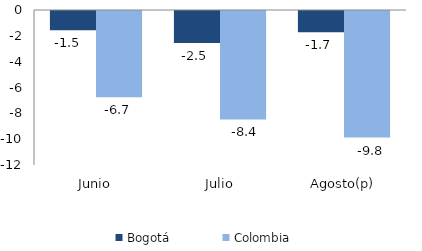
| Category | Bogotá | Colombia |
|---|---|---|
| Junio | -1.485 | -6.684 |
| Julio | -2.474 | -8.398 |
| Agosto(p) | -1.653 | -9.801 |